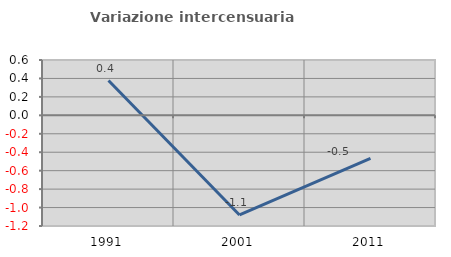
| Category | Variazione intercensuaria annua |
|---|---|
| 1991.0 | 0.377 |
| 2001.0 | -1.08 |
| 2011.0 | -0.468 |